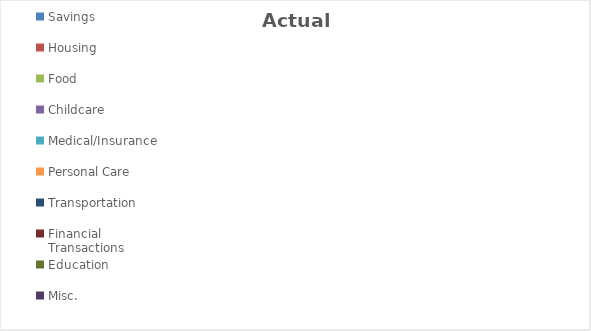
| Category | Actual Expenses |
|---|---|
| Savings | 0 |
| Housing | 0 |
| Food | 0 |
| Childcare | 0 |
| Medical/Insurance | 0 |
| Personal Care | 0 |
| Transportation | 0 |
| Financial Transactions | 0 |
| Education | 0 |
| Misc. | 0 |